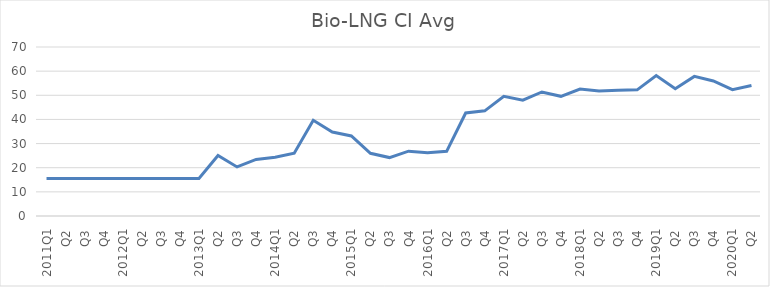
| Category | Bio-LNG CI Avg |
|---|---|
| 2011Q1 | 15.56 |
| Q2 | 15.56 |
| Q3 | 15.56 |
| Q4 | 15.56 |
| 2012Q1 | 15.56 |
| Q2 | 15.56 |
| Q3 | 15.56 |
| Q4 | 15.56 |
| 2013Q1 | 15.56 |
| Q2 | 25.06 |
| Q3 | 20.32 |
| Q4 | 23.42 |
| 2014Q1 | 24.31 |
| Q2 | 26 |
| Q3 | 39.65 |
| Q4 | 34.76 |
| 2015Q1 | 33.17 |
| Q2 | 25.96 |
| Q3 | 24.2 |
| Q4 | 26.86 |
| 2016Q1 | 26.17 |
| Q2 | 26.78 |
| Q3 | 42.66 |
| Q4 | 43.55 |
| 2017Q1 | 49.59 |
| Q2 | 47.97 |
| Q3 | 51.38 |
| Q4 | 49.57 |
| 2018Q1 | 52.59 |
| Q2 | 51.78 |
| Q3 | 52.1 |
| Q4 | 52.25 |
| 2019Q1 | 58.14 |
| Q2 | 52.69 |
| Q3 | 57.83 |
| Q4 | 55.92 |
| 2020Q1 | 52.31 |
| Q2 | 54.07 |